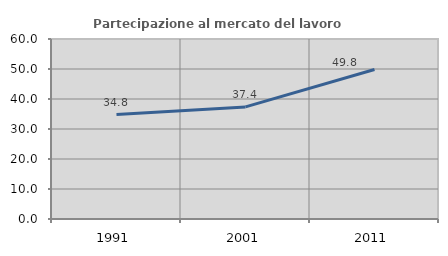
| Category | Partecipazione al mercato del lavoro  femminile |
|---|---|
| 1991.0 | 34.831 |
| 2001.0 | 37.37 |
| 2011.0 | 49.848 |